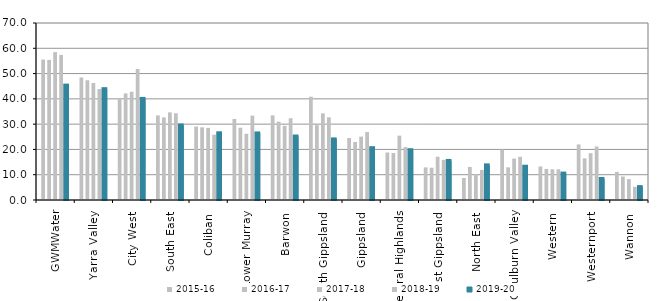
| Category | 2015-16 | 2016-17 | 2017-18 | 2018-19 | 2019-20 |
|---|---|---|---|---|---|
| GWMWater | 55.538 | 55.408 | 58.486 | 57.381 | 45.238 |
| Yarra Valley  | 48.454 | 47.372 | 46.279 | 43.885 | 43.832 |
| City West  | 40.148 | 42.147 | 42.817 | 51.797 | 39.98 |
| South East  | 33.47 | 32.666 | 34.663 | 34.281 | 29.462 |
| Coliban  | 29.052 | 28.745 | 28.514 | 25.813 | 26.375 |
| Lower Murray  | 32.048 | 28.589 | 26.187 | 33.365 | 26.327 |
| Barwon  | 33.472 | 30.98 | 29.333 | 32.333 | 25.113 |
| South Gippsland  | 40.851 | 29.603 | 34.27 | 32.705 | 23.963 |
| Gippsland  | 24.516 | 22.942 | 25.057 | 26.866 | 20.489 |
| Central Highlands  | 18.787 | 18.575 | 25.444 | 20.918 | 19.684 |
| East Gippsland  | 12.9 | 12.756 | 17.104 | 15.871 | 15.444 |
| North East  | 8.713 | 13.068 | 10.321 | 11.898 | 13.695 |
| Goulburn Valley  | 19.938 | 12.923 | 16.378 | 17.094 | 13.159 |
| Western  | 13.259 | 12.28 | 12.153 | 12.124 | 10.443 |
| Westernport  | 21.975 | 16.471 | 18.522 | 21.154 | 8.316 |
| Wannon  | 11.122 | 9.289 | 8.262 | 5.211 | 5.101 |